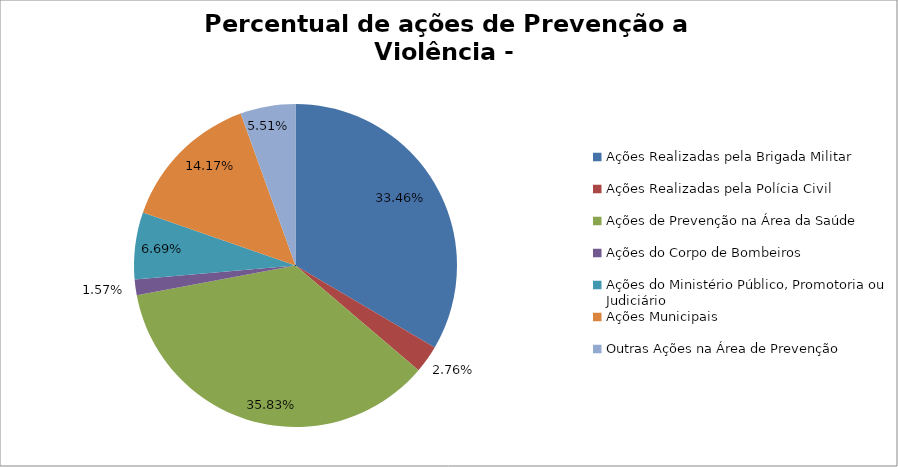
| Category | Percentual |
|---|---|
| Ações Realizadas pela Brigada Militar | 0.335 |
| Ações Realizadas pela Polícia Civil | 0.028 |
| Ações de Prevenção na Área da Saúde | 0.358 |
| Ações do Corpo de Bombeiros | 0.016 |
| Ações do Ministério Público, Promotoria ou Judiciário | 0.067 |
| Ações Municipais | 0.142 |
| Outras Ações na Área de Prevenção | 0.055 |